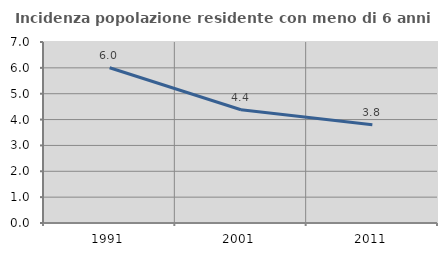
| Category | Incidenza popolazione residente con meno di 6 anni |
|---|---|
| 1991.0 | 6.006 |
| 2001.0 | 4.38 |
| 2011.0 | 3.797 |